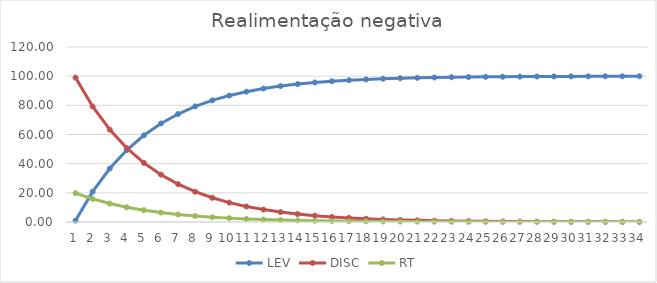
| Category | LEV | DISC | RT |
|---|---|---|---|
| 0 | 1 | 99 | 19.8 |
| 1 | 20.8 | 79.2 | 15.84 |
| 2 | 36.64 | 63.36 | 12.672 |
| 3 | 49.312 | 50.688 | 10.138 |
| 4 | 59.45 | 40.55 | 8.11 |
| 5 | 67.56 | 32.44 | 6.488 |
| 6 | 74.048 | 25.952 | 5.19 |
| 7 | 79.238 | 20.762 | 4.152 |
| 8 | 83.391 | 16.609 | 3.322 |
| 9 | 86.712 | 13.288 | 2.658 |
| 10 | 89.37 | 10.63 | 2.126 |
| 11 | 91.496 | 8.504 | 1.701 |
| 12 | 93.197 | 6.803 | 1.361 |
| 13 | 94.557 | 5.443 | 1.089 |
| 14 | 95.646 | 4.354 | 0.871 |
| 15 | 96.517 | 3.483 | 0.697 |
| 16 | 97.213 | 2.787 | 0.557 |
| 17 | 97.771 | 2.229 | 0.446 |
| 18 | 98.217 | 1.783 | 0.357 |
| 19 | 98.573 | 1.427 | 0.285 |
| 20 | 98.859 | 1.141 | 0.228 |
| 21 | 99.087 | 0.913 | 0.183 |
| 22 | 99.27 | 0.73 | 0.146 |
| 23 | 99.416 | 0.584 | 0.117 |
| 24 | 99.532 | 0.468 | 0.094 |
| 25 | 99.626 | 0.374 | 0.075 |
| 26 | 99.701 | 0.299 | 0.06 |
| 27 | 99.761 | 0.239 | 0.048 |
| 28 | 99.809 | 0.191 | 0.038 |
| 29 | 99.847 | 0.153 | 0.031 |
| 30 | 99.877 | 0.123 | 0.025 |
| 31 | 99.902 | 0.098 | 0.02 |
| 32 | 99.922 | 0.078 | 0.016 |
| 33 | 99.937 | 0.063 | 0.013 |